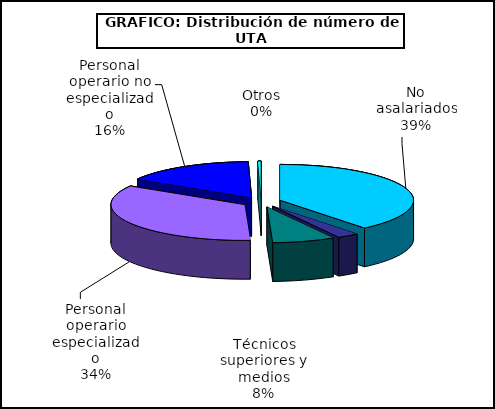
| Category | Series 0 |
|---|---|
| No asalariados | 2464 |
| Administrativos | 166 |
| Técnicos superiores y medios | 477 |
| Personal operario especializado | 2167 |
| Personal operario no especializado | 1002 |
| Otros | 25 |